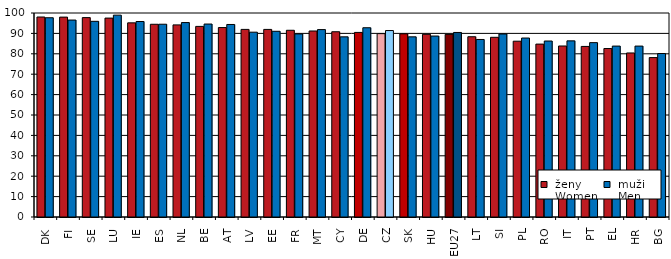
| Category |  ženy 
 Women |  muži 
 Men |
|---|---|---|
| DK | 98.039 | 97.678 |
| FI | 97.98 | 96.542 |
| SE | 97.737 | 95.924 |
| LU | 97.51 | 98.946 |
| IE | 95.169 | 95.822 |
| ES | 94.472 | 94.499 |
| NL | 94.178 | 95.308 |
| BE | 93.431 | 94.59 |
| AT | 92.862 | 94.375 |
| LV | 91.965 | 90.595 |
| EE | 91.951 | 91.036 |
| FR | 91.533 | 89.739 |
| MT | 91.182 | 91.861 |
| CY | 90.816 | 88.313 |
| DE | 90.484 | 92.772 |
| CZ | 89.886 | 91.402 |
| SK | 89.8 | 88.319 |
| HU | 89.554 | 88.709 |
| EU27 | 89.536 | 90.462 |
| LT | 88.366 | 87.02 |
| SI | 88.083 | 89.699 |
| PL | 86.177 | 87.736 |
| RO | 84.754 | 86.263 |
| IT | 83.829 | 86.338 |
| PT | 83.609 | 85.472 |
| EL | 82.583 | 83.78 |
| HR | 80.409 | 83.783 |
| BG | 78.141 | 80.139 |